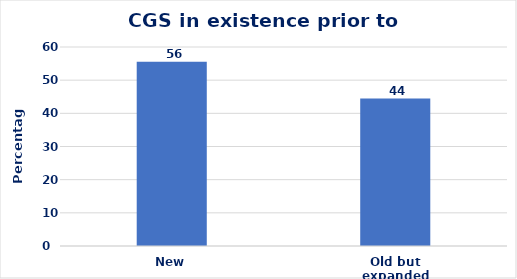
| Category | Percent |
|---|---|
| New | 55.556 |
| Old but expanded | 44.444 |